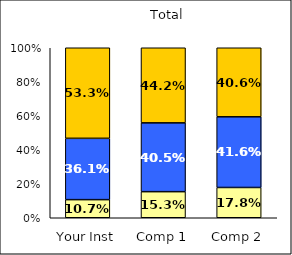
| Category | Low Positive Cross-Racial Interaction | Average Positive Cross-Racial Interaction | High Positive Cross-Racial Interaction |
|---|---|---|---|
| Your Inst | 0.107 | 0.361 | 0.533 |
| Comp 1 | 0.153 | 0.405 | 0.442 |
| Comp 2 | 0.178 | 0.416 | 0.406 |